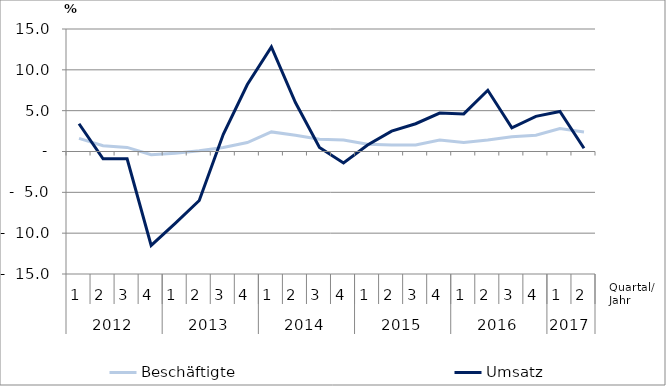
| Category | Beschäftigte | Umsatz |
|---|---|---|
| 0 | 1.6 | 3.4 |
| 1 | 0.7 | -0.9 |
| 2 | 0.5 | -0.9 |
| 3 | -0.4 | -11.5 |
| 4 | -0.2 | -8.8 |
| 5 | 0.1 | -6 |
| 6 | 0.5 | 2.1 |
| 7 | 1.1 | 8.2 |
| 8 | 2.4 | 12.8 |
| 9 | 2 | 6 |
| 10 | 1.5 | 0.5 |
| 11 | 1.4 | -1.4 |
| 12 | 0.9 | 0.8 |
| 13 | 0.8 | 2.5 |
| 14 | 0.8 | 3.4 |
| 15 | 1.4 | 4.7 |
| 16 | 1.1 | 4.6 |
| 17 | 1.4 | 7.5 |
| 18 | 1.8 | 2.9 |
| 19 | 2 | 4.3 |
| 20 | 2.8 | 4.9 |
| 21 | 2.4 | 0.4 |